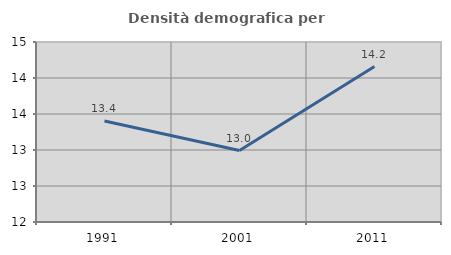
| Category | Densità demografica |
|---|---|
| 1991.0 | 13.402 |
| 2001.0 | 12.992 |
| 2011.0 | 14.159 |